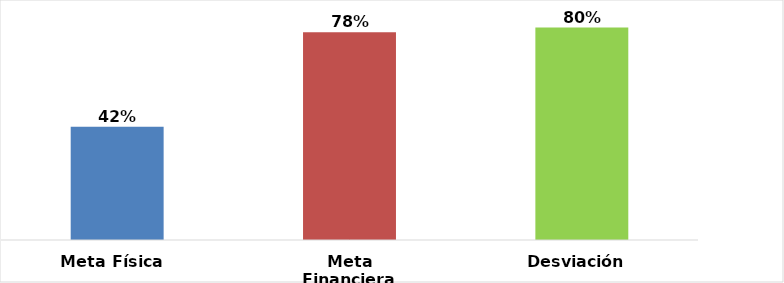
| Category | Meta Física  |
|---|---|
| Meta Física  | 0.424 |
| Meta Financiera | 0.779 |
| Desviación  | 0.797 |